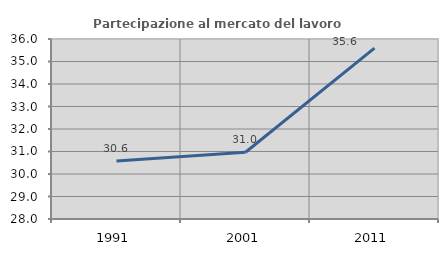
| Category | Partecipazione al mercato del lavoro  femminile |
|---|---|
| 1991.0 | 30.573 |
| 2001.0 | 30.966 |
| 2011.0 | 35.593 |